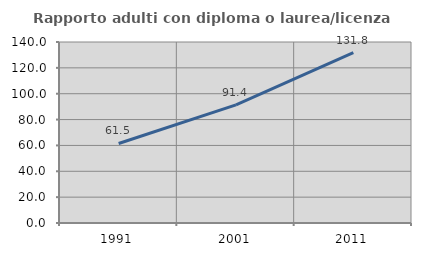
| Category | Rapporto adulti con diploma o laurea/licenza media  |
|---|---|
| 1991.0 | 61.502 |
| 2001.0 | 91.358 |
| 2011.0 | 131.833 |